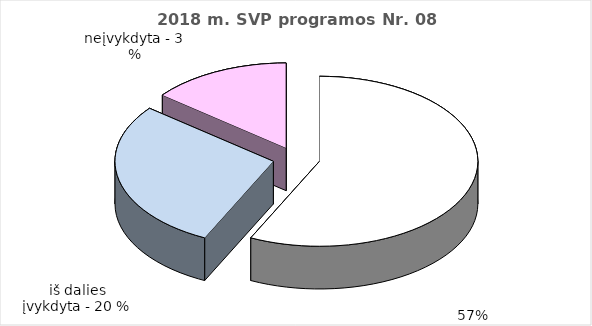
| Category | Series 0 |
|---|---|
| 0 | 24 |
| 1 | 12 |
| 2 | 6 |